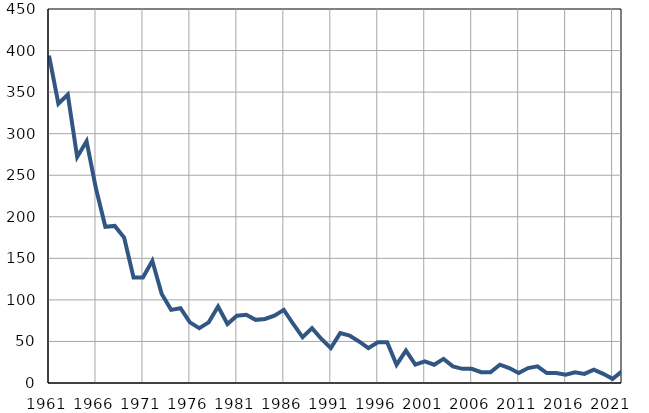
| Category | Умрла 
одојчад |
|---|---|
| 1961.0 | 394 |
| 1962.0 | 336 |
| 1963.0 | 347 |
| 1964.0 | 272 |
| 1965.0 | 291 |
| 1966.0 | 234 |
| 1967.0 | 188 |
| 1968.0 | 189 |
| 1969.0 | 175 |
| 1970.0 | 127 |
| 1971.0 | 127 |
| 1972.0 | 147 |
| 1973.0 | 107 |
| 1974.0 | 88 |
| 1975.0 | 90 |
| 1976.0 | 73 |
| 1977.0 | 66 |
| 1978.0 | 73 |
| 1979.0 | 92 |
| 1980.0 | 71 |
| 1981.0 | 81 |
| 1982.0 | 82 |
| 1983.0 | 76 |
| 1984.0 | 77 |
| 1985.0 | 81 |
| 1986.0 | 88 |
| 1987.0 | 71 |
| 1988.0 | 55 |
| 1989.0 | 66 |
| 1990.0 | 53 |
| 1991.0 | 42 |
| 1992.0 | 60 |
| 1993.0 | 57 |
| 1994.0 | 50 |
| 1995.0 | 42 |
| 1996.0 | 49 |
| 1997.0 | 49 |
| 1998.0 | 22 |
| 1999.0 | 39 |
| 2000.0 | 22 |
| 2001.0 | 26 |
| 2002.0 | 22 |
| 2003.0 | 29 |
| 2004.0 | 20 |
| 2005.0 | 17 |
| 2006.0 | 17 |
| 2007.0 | 13 |
| 2008.0 | 13 |
| 2009.0 | 22 |
| 2010.0 | 18 |
| 2011.0 | 12 |
| 2012.0 | 18 |
| 2013.0 | 20 |
| 2014.0 | 12 |
| 2015.0 | 12 |
| 2016.0 | 10 |
| 2017.0 | 13 |
| 2018.0 | 11 |
| 2019.0 | 16 |
| 2020.0 | 11 |
| 2021.0 | 5 |
| 2022.0 | 14 |